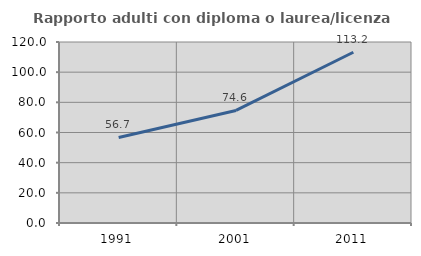
| Category | Rapporto adulti con diploma o laurea/licenza media  |
|---|---|
| 1991.0 | 56.693 |
| 2001.0 | 74.625 |
| 2011.0 | 113.185 |